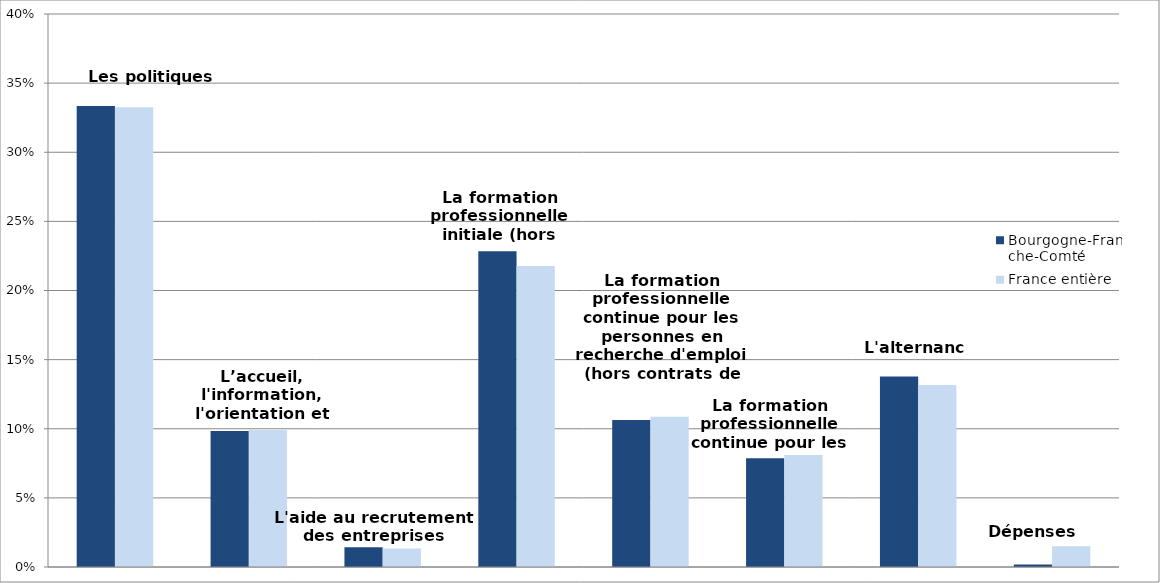
| Category | Bourgogne-Franche-Comté | France entière |
|---|---|---|
| Les politiques d'emploi | 0.333 | 0.333 |
| L’accueil, l'information, l'orientation et l'accompagnement | 0.098 | 0.099 |
| L'aide au recrutement des entreprises | 0.014 | 0.013 |
| La formation professionnelle initiale (hors apprentissage) | 0.228 | 0.218 |
| La formation professionnelle continue pour les personnes en recherche d'emploi (hors contrats de professionnalisation) | 0.106 | 0.109 |
| La formation professionnelle continue pour les actifs occupés | 0.079 | 0.081 |
| L'alternance | 0.138 | 0.132 |
| Dépenses non-ventilables | 0.002 | 0.015 |